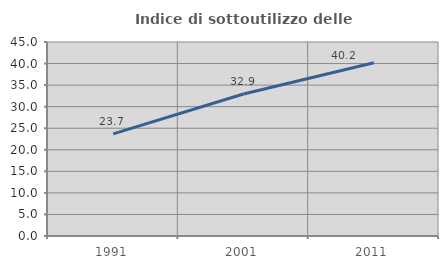
| Category | Indice di sottoutilizzo delle abitazioni  |
|---|---|
| 1991.0 | 23.685 |
| 2001.0 | 32.925 |
| 2011.0 | 40.177 |